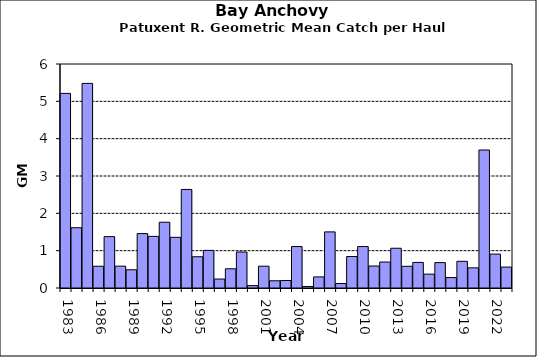
| Category | Series 0 |
|---|---|
| 1983.0 | 5.213 |
| 1984.0 | 1.615 |
| 1985.0 | 5.48 |
| 1986.0 | 0.583 |
| 1987.0 | 1.376 |
| 1988.0 | 0.585 |
| 1989.0 | 0.489 |
| 1990.0 | 1.457 |
| 1991.0 | 1.383 |
| 1992.0 | 1.762 |
| 1993.0 | 1.358 |
| 1994.0 | 2.64 |
| 1995.0 | 0.838 |
| 1996.0 | 1.008 |
| 1997.0 | 0.24 |
| 1998.0 | 0.515 |
| 1999.0 | 0.965 |
| 2000.0 | 0.063 |
| 2001.0 | 0.584 |
| 2002.0 | 0.193 |
| 2003.0 | 0.201 |
| 2004.0 | 1.11 |
| 2005.0 | 0.039 |
| 2006.0 | 0.297 |
| 2007.0 | 1.503 |
| 2008.0 | 0.12 |
| 2009.0 | 0.843 |
| 2010.0 | 1.11 |
| 2011.0 | 0.589 |
| 2012.0 | 0.696 |
| 2013.0 | 1.065 |
| 2014.0 | 0.582 |
| 2015.0 | 0.685 |
| 2016.0 | 0.371 |
| 2017.0 | 0.68 |
| 2018.0 | 0.279 |
| 2019.0 | 0.715 |
| 2020.0 | 0.54 |
| 2021.0 | 3.696 |
| 2022.0 | 0.908 |
| 2023.0 | 0.56 |